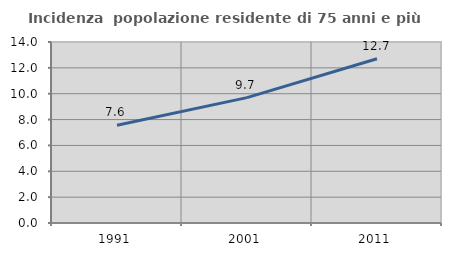
| Category | Incidenza  popolazione residente di 75 anni e più |
|---|---|
| 1991.0 | 7.565 |
| 2001.0 | 9.699 |
| 2011.0 | 12.705 |